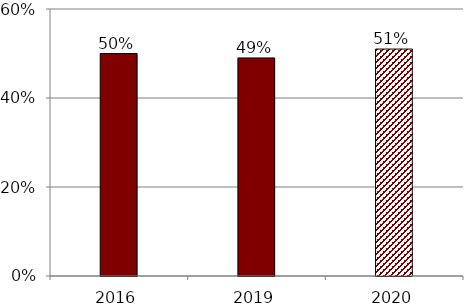
| Category | Series 0 |
|---|---|
| 2016.0 | 0.5 |
| 2019.0 | 0.49 |
| 2020.0 | 0.51 |